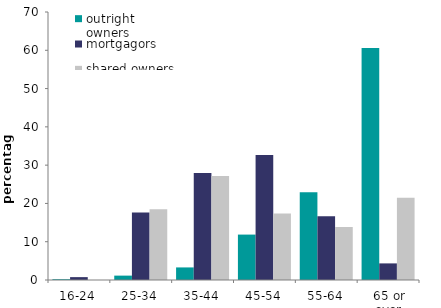
| Category | outright owners | mortgagors | shared owners |
|---|---|---|---|
| 16-24 | 0.208 | 0.751 | 0 |
| 25-34 | 1.144 | 17.654 | 18.487 |
| 35-44 | 3.285 | 27.94 | 27.174 |
| 45-54 | 11.861 | 32.654 | 17.37 |
| 55-64 | 22.932 | 16.665 | 13.829 |
| 65 or over | 60.569 | 4.337 | 21.488 |